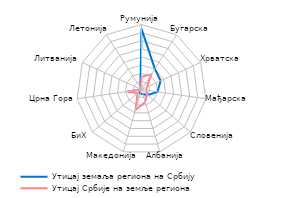
| Category | Утицај земаља региона на Србију | Утицај Србије на земље региона |
|---|---|---|
| Румунија | 0.374 | 0.078 |
| Бугарска | 0.151 | 0.11 |
| Хрватска | 0.129 | 0.037 |
| Мађарска | 0.1 | 0.029 |
| Словенија | 0.052 | 0.046 |
| Албанија | 0.03 | 0.081 |
| Македонија | 0.027 | 0.13 |
| БиХ | 0.017 | 0.031 |
| Црна Гора | 0.007 | 0.088 |
| Литванија | 0.004 | 0.003 |
| Летонија | 0.002 | 0.002 |